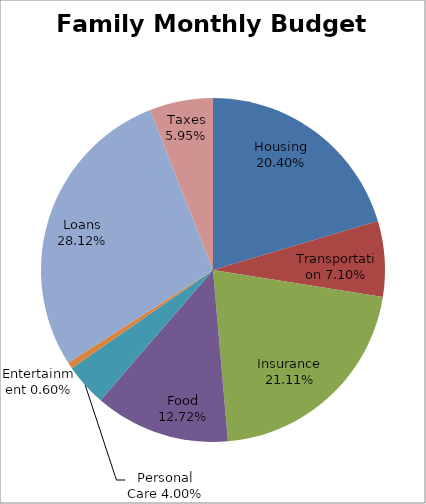
| Category | Family Monthly Budget |
|---|---|
| Housing | 743.51 |
| Transportation | 258.83 |
| Insurance | 769.28 |
| Food | 463.41 |
| Personal Care | 145.63 |
| Entertainment | 21.87 |
| Loans | 1024.63 |
| Taxes | 216.97 |